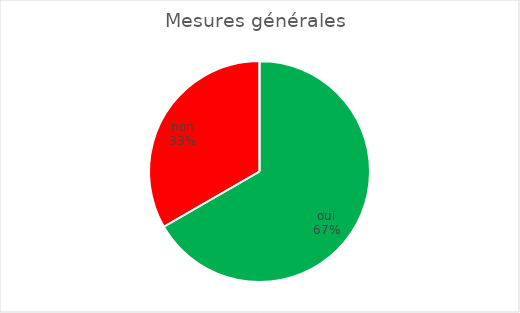
| Category | Mesures générales  |
|---|---|
| oui | 10 |
| non | 5 |